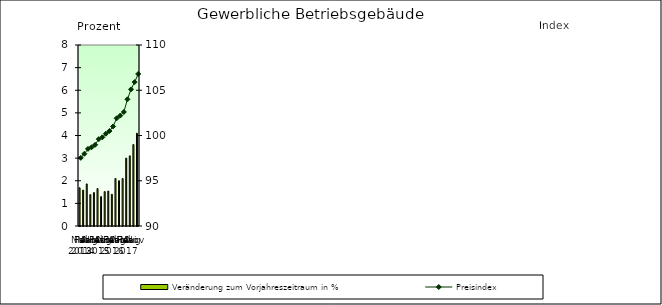
| Category | Veränderung zum Vorjahreszeitraum in % |
|---|---|
| 0 | 1.689 |
| 1 | 1.586 |
| 2 | 1.86 |
| 3 | 1.386 |
| 4 | 1.476 |
| 5 | 1.653 |
| 6 | 1.299 |
| 7 | 1.519 |
| 8 | 1.546 |
| 9 | 1.4 |
| 10 | 2.1 |
| 11 | 2 |
| 12 | 2.1 |
| 13 | 3 |
| 14 | 3.1 |
| 15 | 3.6 |
| 16 | 4.1 |